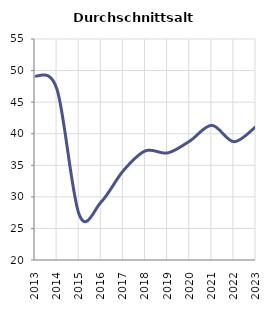
| Category | Durchschnittsalter |
|---|---|
| 2013.0 | 49.182 |
| 2014.0 | 46.976 |
| 2015.0 | 27.168 |
| 2016.0 | 29.218 |
| 2017.0 | 34.164 |
| 2018.0 | 37.293 |
| 2019.0 | 36.955 |
| 2020.0 | 38.83 |
| 2021.0 | 41.328 |
| 2022.0 | 38.73 |
| 2023.0 | 41.136 |